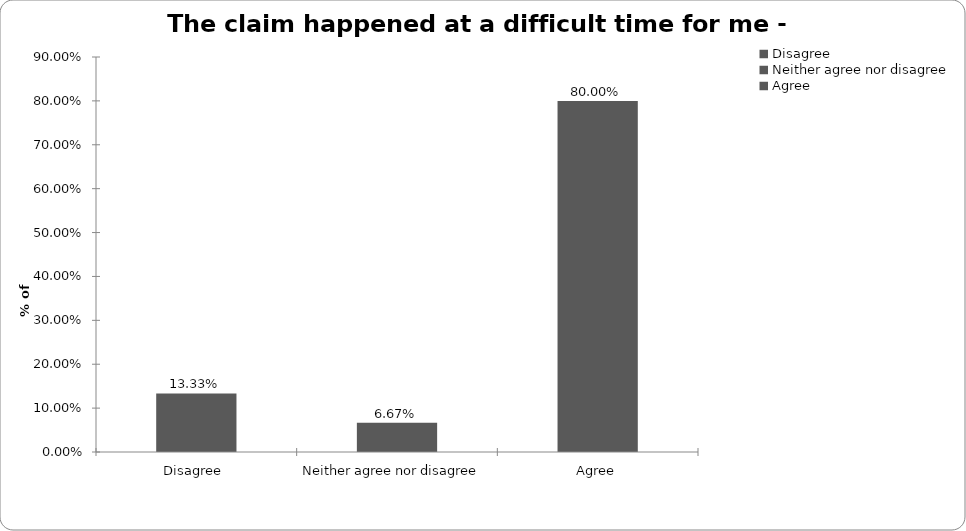
| Category | Travel |
|---|---|
| Disagree  | 0.133 |
| Neither agree nor disagree  | 0.067 |
| Agree | 0.8 |